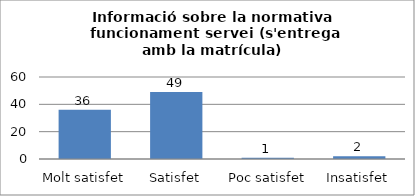
| Category | Series 0 |
|---|---|
| Molt satisfet | 36 |
| Satisfet | 49 |
| Poc satisfet | 1 |
| Insatisfet | 2 |